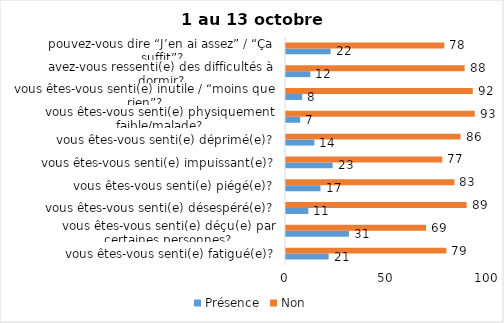
| Category | Présence | Non |
|---|---|---|
| vous êtes-vous senti(e) fatigué(e)? | 21 | 79 |
| vous êtes-vous senti(e) déçu(e) par certaines personnes? | 31 | 69 |
| vous êtes-vous senti(e) désespéré(e)? | 11 | 89 |
| vous êtes-vous senti(e) piégé(e)? | 17 | 83 |
| vous êtes-vous senti(e) impuissant(e)? | 23 | 77 |
| vous êtes-vous senti(e) déprimé(e)? | 14 | 86 |
| vous êtes-vous senti(e) physiquement faible/malade? | 7 | 93 |
| vous êtes-vous senti(e) inutile / “moins que rien”? | 8 | 92 |
| avez-vous ressenti(e) des difficultés à dormir? | 12 | 88 |
| pouvez-vous dire “J’en ai assez” / “Ça suffit”? | 22 | 78 |